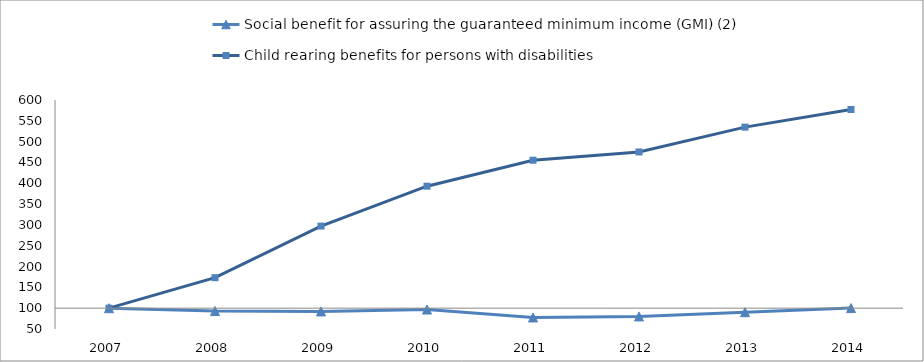
| Category | Social benefit for assuring the guaranteed minimum income (GMI) (2) | Child rearing benefits for persons with disabilities  |
|---|---|---|
| 2007.0 | 100 | 100 |
| 2008.0 | 93.149 | 173.234 |
| 2009.0 | 92.244 | 297.147 |
| 2010.0 | 96.724 | 393.003 |
| 2011.0 | 77.717 | 455.367 |
| 2012.0 | 80.218 | 475.204 |
| 2013.0 | 90.373 | 534.851 |
| 2014.0 | 100.159 | 577.242 |